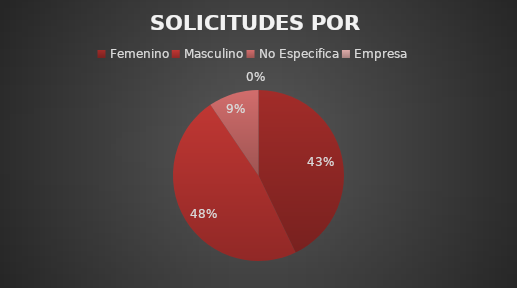
| Category | TOTAL |
|---|---|
| Femenino | 9 |
| Masculino | 10 |
| No Especifica | 2 |
| Empresa | 0 |